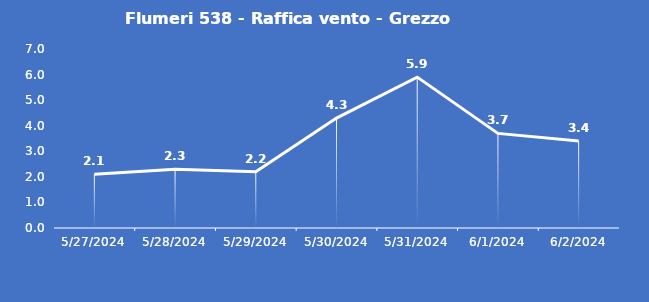
| Category | Flumeri 538 - Raffica vento - Grezzo (m/s) |
|---|---|
| 5/27/24 | 2.1 |
| 5/28/24 | 2.3 |
| 5/29/24 | 2.2 |
| 5/30/24 | 4.3 |
| 5/31/24 | 5.9 |
| 6/1/24 | 3.7 |
| 6/2/24 | 3.4 |